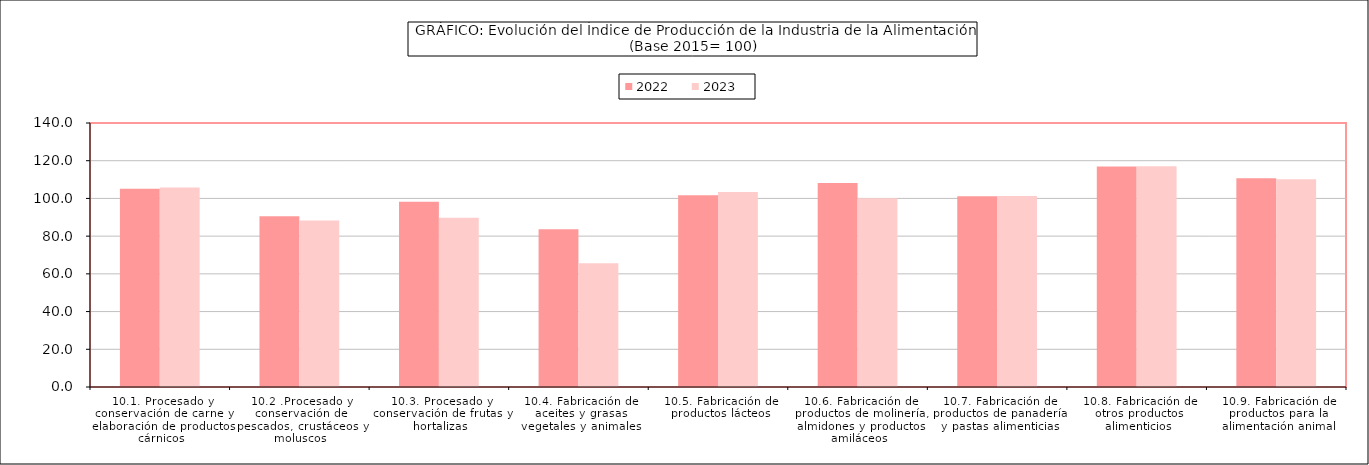
| Category | 2022 | 2023 |
|---|---|---|
| 10.1. Procesado y conservación de carne y elaboración de productos cárnicos | 105.116 | 105.845 |
| 10.2 .Procesado y conservación de pescados, crustáceos y moluscos | 90.539 | 88.292 |
| 10.3. Procesado y conservación de frutas y hortalizas | 98.228 | 89.706 |
| 10.4. Fabricación de aceites y grasas vegetales y animales | 83.59 | 65.617 |
| 10.5. Fabricación de productos lácteos | 101.655 | 103.457 |
| 10.6. Fabricación de productos de molinería, almidones y productos amiláceos | 108.238 | 100.061 |
| 10.7. Fabricación de productos de panadería y pastas alimenticias | 101.173 | 101.235 |
| 10.8. Fabricación de otros productos alimenticios | 116.907 | 117.048 |
| 10.9. Fabricación de productos para la alimentación animal | 110.698 | 110.107 |